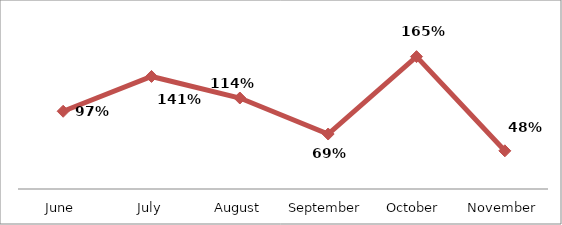
| Category | PERCENTAGE |
|---|---|
| June | 0.972 |
| July | 1.407 |
| August | 1.137 |
| September | 0.687 |
| October | 1.655 |
| November | 0.477 |